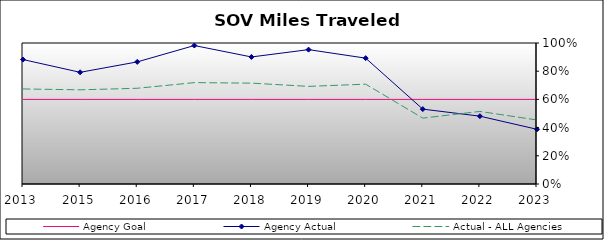
| Category | Agency Goal | Agency Actual | Actual - ALL Agencies |
|---|---|---|---|
| 2013.0 | 0.6 | 0.883 | 0.674 |
| 2015.0 | 0.6 | 0.792 | 0.668 |
| 2016.0 | 0.6 | 0.866 | 0.679 |
| 2017.0 | 0.6 | 0.982 | 0.719 |
| 2018.0 | 0.6 | 0.901 | 0.715 |
| 2019.0 | 0.6 | 0.953 | 0.692 |
| 2020.0 | 0.6 | 0.893 | 0.708 |
| 2021.0 | 0.6 | 0.531 | 0.467 |
| 2022.0 | 0.6 | 0.481 | 0.515 |
| 2023.0 | 0.6 | 0.388 | 0.454 |